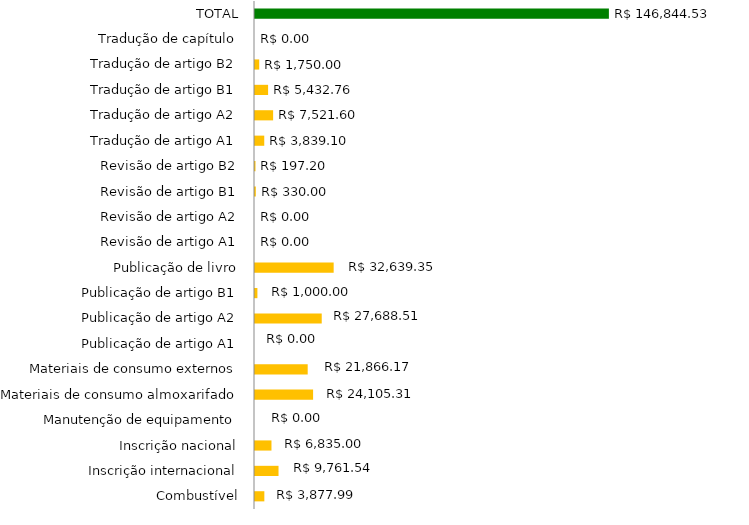
| Category | Series 1 |
|---|---|
| Combustível | 3877.99 |
| Inscrição internacional | 9761.54 |
| Inscrição nacional | 6835 |
| Manutenção de equipamento | 0 |
| Materiais de consumo almoxarifado | 24105.31 |
| Materiais de consumo externos | 21866.17 |
| Publicação de artigo A1 | 0 |
| Publicação de artigo A2 | 27688.51 |
| Publicação de artigo B1 | 1000 |
| Publicação de livro | 32639.35 |
| Revisão de artigo A1 | 0 |
| Revisão de artigo A2 | 0 |
| Revisão de artigo B1 | 330 |
| Revisão de artigo B2 | 197.2 |
| Tradução de artigo A1 | 3839.1 |
| Tradução de artigo A2 | 7521.6 |
| Tradução de artigo B1 | 5432.76 |
| Tradução de artigo B2 | 1750 |
| Tradução de capítulo | 0 |
| TOTAL | 146844.53 |